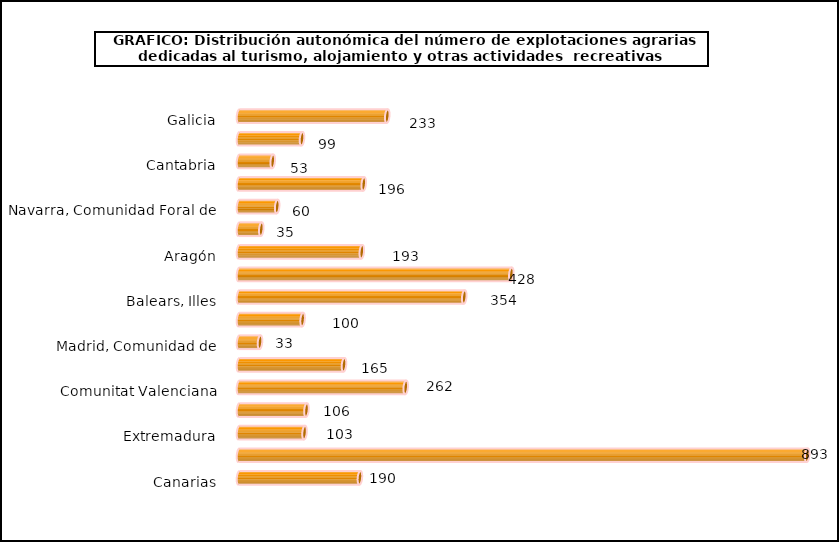
| Category | num. Explotaciones |
|---|---|
| Galicia | 233 |
| Asturias, Principado de | 99 |
| Cantabria | 53 |
| País Vasco | 196 |
| Navarra, Comunidad Foral de | 60 |
| Rioja, La | 35 |
| Aragón | 193 |
| Cataluña | 428 |
| Balears, Illes | 354 |
| Castilla y León | 100 |
| Madrid, Comunidad de | 33 |
| Castilla - La Mancha | 165 |
| Comunitat Valenciana | 262 |
| Murcia, Región de | 106 |
| Extremadura | 103 |
| Andalucía | 893 |
| Canarias | 190 |